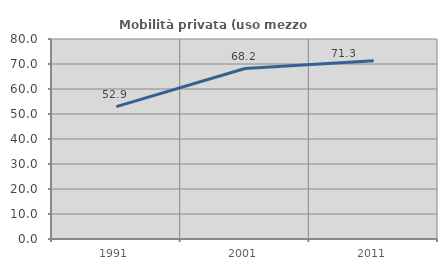
| Category | Mobilità privata (uso mezzo privato) |
|---|---|
| 1991.0 | 52.926 |
| 2001.0 | 68.186 |
| 2011.0 | 71.298 |